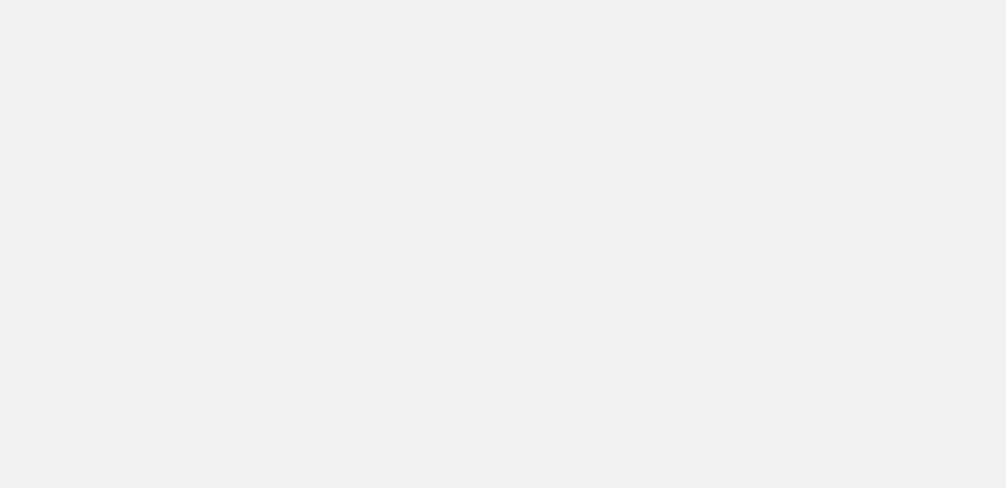
| Category | Total |
|---|---|
| Al Hodeidah | 604 |
| Hajjah | 484 |
| Marib | 224 |
| Taiz | 197 |
| Al Jawf | 171 |
| Amran | 150 |
| Lahj | 69 |
| Abyan | 66 |
| Ad Dali | 54 |
| Sanaa | 52 |
| Ibb | 45 |
| Sadah | 44 |
| Al Bayda | 38 |
| Aden | 31 |
| Hadramawt | 23 |
| Dhamar | 22 |
| Shabwah | 17 |
| Al Maharah | 14 |
| Sanaa City | 8 |
| Raymah | 8 |
| Al Mahwit | 8 |
| Socotra | 1 |